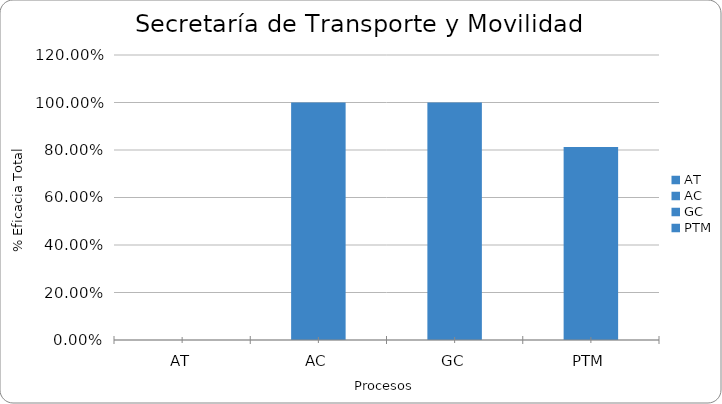
| Category | % Eficacia total |
|---|---|
| AT | 0 |
| AC | 1 |
| GC | 1 |
| PTM | 0.812 |